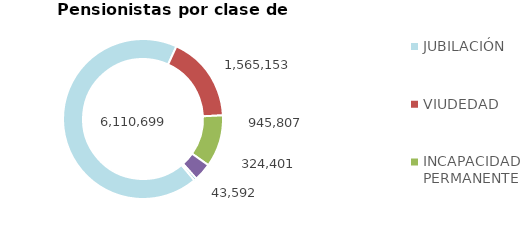
| Category | Series 0 |
|---|---|
| JUBILACIÓN | 6110699 |
| VIUDEDAD | 1565153 |
| INCAPACIDAD PERMANENTE | 945807 |
| ORFANDAD | 324401 |
| FAVOR DE FAMILIARES | 43592 |